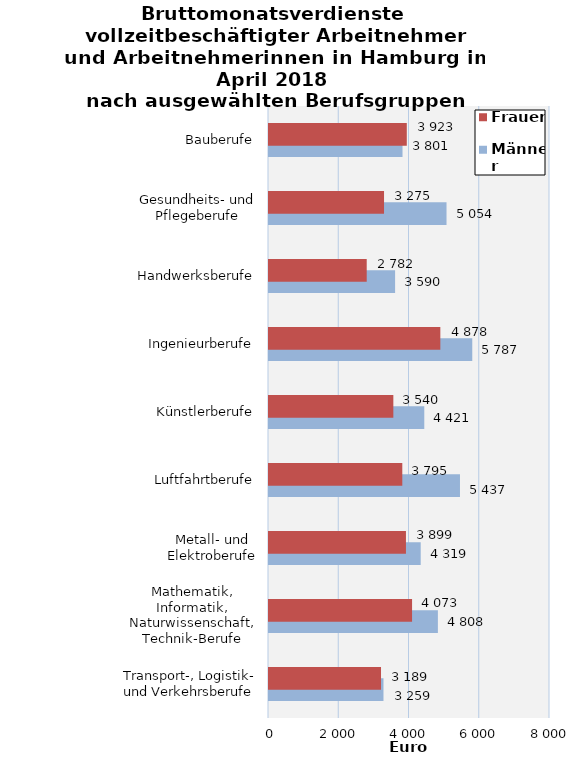
| Category | Männer | Frauen |
|---|---|---|
| Transport-, Logistik- und Verkehrsberufe | 3259 | 3189 |
| Mathematik, Informatik, Naturwissenschaft, Technik-Berufe | 4808 | 4073 |
| Metall- und Elektroberufe | 4319 | 3899 |
| Luftfahrtberufe | 5437 | 3795 |
| Künstlerberufe | 4421 | 3540 |
| Ingenieurberufe | 5787 | 4878 |
| Handwerksberufe | 3590 | 2782 |
| Gesundheits- und Pflegeberufe | 5054 | 3275 |
| Bauberufe | 3801 | 3923 |